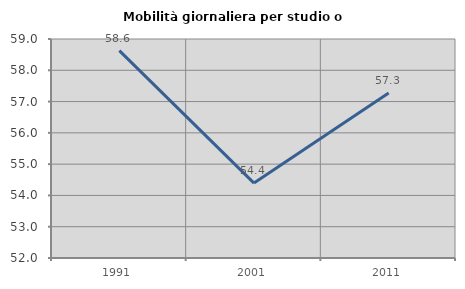
| Category | Mobilità giornaliera per studio o lavoro |
|---|---|
| 1991.0 | 58.628 |
| 2001.0 | 54.394 |
| 2011.0 | 57.277 |